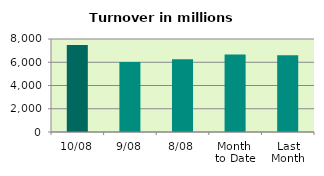
| Category | Series 0 |
|---|---|
| 10/08 | 7491.516 |
| 9/08 | 6028.456 |
| 8/08 | 6267.359 |
| Month 
to Date | 6658.313 |
| Last
Month | 6596.564 |